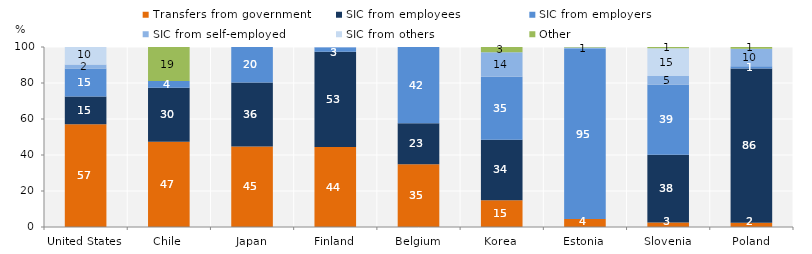
| Category | Transfers from government | SIC from employees | SIC from employers | SIC from self-employed | SIC from others | Other |
|---|---|---|---|---|---|---|
| United States | 57.018 | 15.499 | 15.484 | 2.326 | 9.673 | 0 |
| Chile | 47.328 | 30.048 | 3.673 | 0 | 0 | 18.951 |
| Japan | 44.697 | 35.517 | 19.786 | 0 | 0 | 0 |
| Finland | 44.39 | 52.907 | 2.622 | 0 | 0.081 | 0 |
| Belgium | 34.823 | 22.826 | 42.35 | 0 | 0 | 0 |
| Korea | 14.884 | 33.636 | 34.989 | 13.553 | 0 | 2.938 |
| Estonia | 4.381 | 0 | 94.552 | 0.824 | 0 | 0.243 |
| Slovenia | 2.512 | 37.605 | 39.071 | 4.768 | 15.314 | 0.737 |
| Poland | 2.318 | 85.805 | 1.151 | 9.811 | 0 | 0.915 |